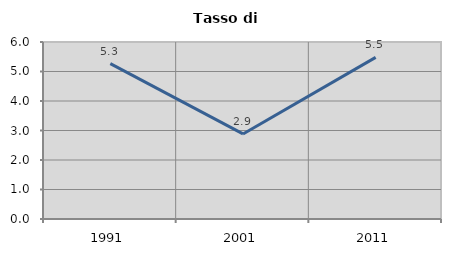
| Category | Tasso di disoccupazione   |
|---|---|
| 1991.0 | 5.268 |
| 2001.0 | 2.883 |
| 2011.0 | 5.479 |